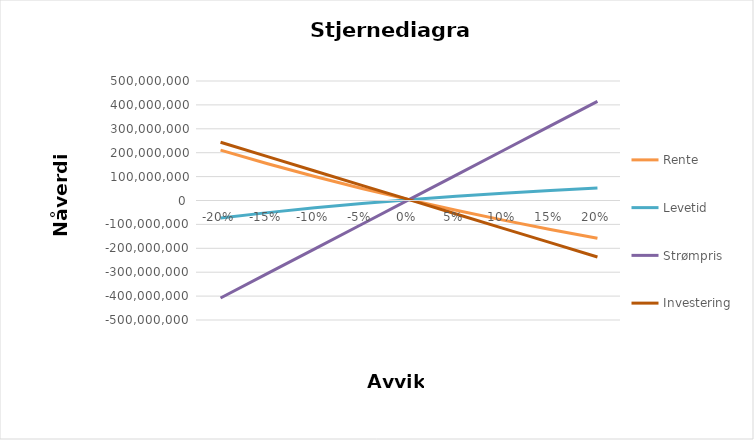
| Category | Rente  | Levetid | Strømpris | Investering |
|---|---|---|---|---|
| -0.2 | 210922569.066 | -73468353.579 | -407866937.309 | 243498819.159 |
| -0.15 | 153904874.356 | -50744402.616 | -305025498.192 | 183498819.159 |
| -0.1 | 100512742.482 | -30520167.155 | -202184059.075 | 123498819.159 |
| -0.05 | 50463371.823 | -12520669.593 | -99342619.958 | 63498819.159 |
| 0.0 | 3498819.159 | 3498819.159 | 3498819.159 | 3498819.159 |
| 0.05 | -40616369.321 | 17756107.119 | 106340258.275 | -56501180.841 |
| 0.1 | -82097287.24 | 30445042.647 | 209181697.392 | -116501180.841 |
| 0.15 | -121140582.953 | 41738150.096 | 312023136.509 | -176501180.841 |
| 0.2 | -157926182.794 | 51788975.521 | 414864575.626 | -236501180.841 |